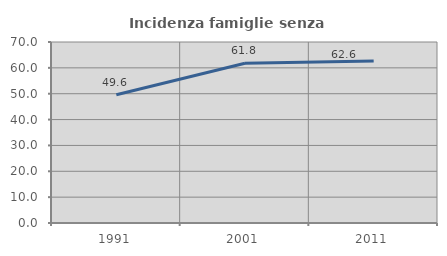
| Category | Incidenza famiglie senza nuclei |
|---|---|
| 1991.0 | 49.573 |
| 2001.0 | 61.765 |
| 2011.0 | 62.617 |